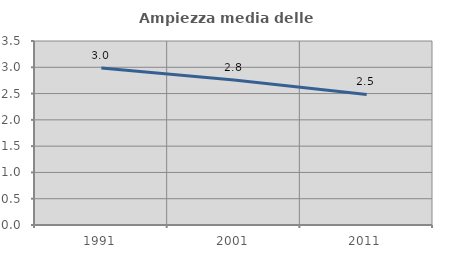
| Category | Ampiezza media delle famiglie |
|---|---|
| 1991.0 | 2.986 |
| 2001.0 | 2.758 |
| 2011.0 | 2.483 |